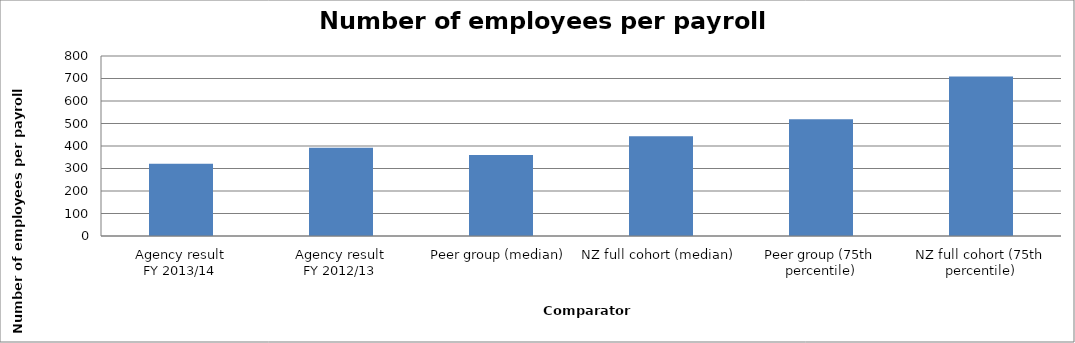
| Category | Result |
|---|---|
| Agency result
FY 2013/14 | 320.611 |
| Agency result
FY 2012/13 | 392.453 |
| Peer group (median) | 360.536 |
| NZ full cohort (median) | 443.678 |
| Peer group (75th percentile) | 519.085 |
| NZ full cohort (75th percentile) | 708.598 |